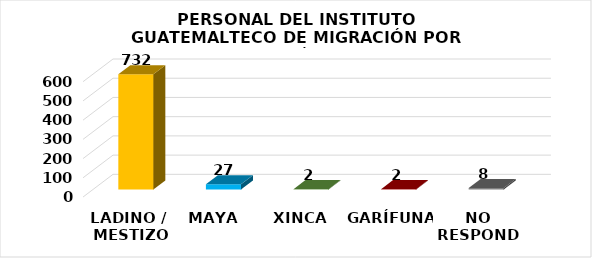
| Category | Series 0 |
|---|---|
| LADINO /
 MESTIZO | 732 |
| MAYA | 27 |
| XINCA | 2 |
| GARÍFUNA | 2 |
| NO RESPONDE | 8 |